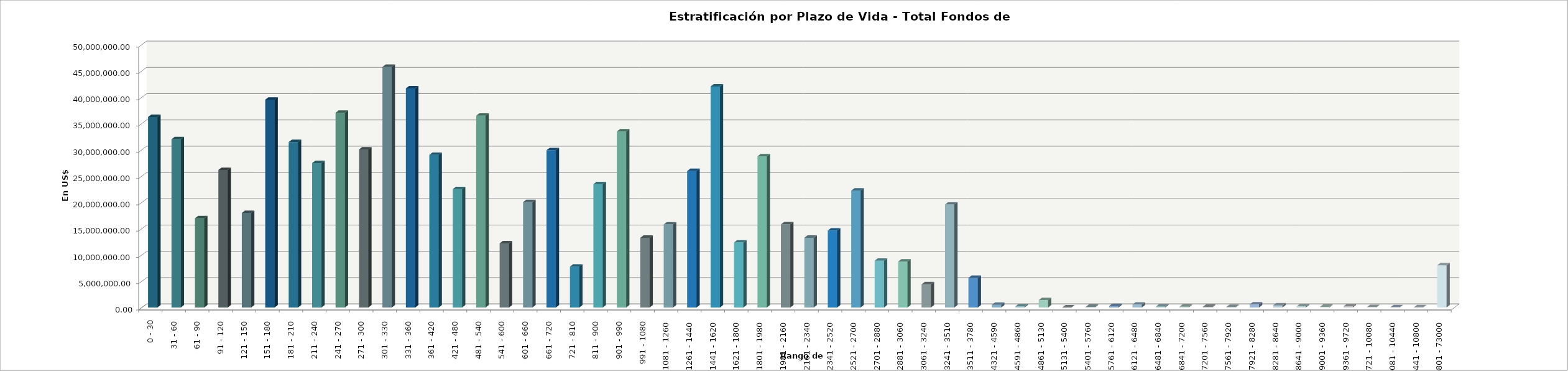
| Category | Series 0 |
|---|---|
| 0 - 30 | 36232549.05 |
| 31 - 60 | 32004515.12 |
| 61 - 90 | 16962720.95 |
| 91 - 120 | 26158762.64 |
| 121 - 150 | 17987198.29 |
| 151 - 180 | 39530458.33 |
| 181 - 210 | 31462611.79 |
| 211 - 240 | 27465920.52 |
| 241 - 270 | 37041248.29 |
| 271 - 300 | 30066348.56 |
| 301 - 330 | 45760358.4 |
| 331 - 360 | 41677657.75 |
| 361 - 420 | 29024042.96 |
| 421 - 480 | 22516963.97 |
| 481 - 540 | 36482868.52 |
| 541 - 600 | 12201735.81 |
| 601 - 660 | 20044693.55 |
| 661 - 720 | 29917309.49 |
| 721 - 810 | 7771566.04 |
| 811 - 900 | 23459099.17 |
| 901 - 990 | 33475967.29 |
| 991 - 1080 | 13257018.47 |
| 1081 - 1260 | 15794206.69 |
| 1261 - 1440 | 25953821.54 |
| 1441 - 1620 | 42041940.81 |
| 1621 - 1800 | 12360040.76 |
| 1801 - 1980 | 28752269.59 |
| 1981 - 2160 | 15801116.77 |
| 2161 - 2340 | 13268798.03 |
| 2341 - 2520 | 14636103.33 |
| 2521 - 2700 | 22229483.12 |
| 2701 - 2880 | 8900786.38 |
| 2881 - 3060 | 8725043.93 |
| 3061 - 3240 | 4403863.77 |
| 3241 - 3510 | 19580772.02 |
| 3511 - 3780 | 5626478.98 |
| 4321 - 4590 | 503227.99 |
| 4591 - 4860 | 197719.63 |
| 4861 - 5130 | 1405639.2 |
| 5131 - 5400 | 2241.98 |
| 5401 - 5760 | 110716.52 |
| 5761 - 6120 | 262160.35 |
| 6121 - 6480 | 545331.69 |
| 6481 - 6840 | 186188.02 |
| 6841 - 7200 | 133285.9 |
| 7201 - 7560 | 127172.01 |
| 7561 - 7920 | 87187.63 |
| 7921 - 8280 | 574508.08 |
| 8281 - 8640 | 386980.77 |
| 8641 - 9000 | 188752.31 |
| 9001 - 9360 | 117959.18 |
| 9361 - 9720 | 193848.72 |
| 9721 - 10080 | 69188.9 |
| 10081 - 10440 | 41647.23 |
| 10441 - 10800 | 20626.82 |
| 10801 - 73000 | 8020663.01 |